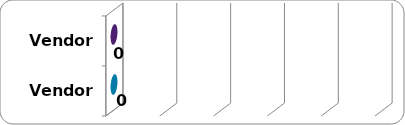
| Category | Series 0 |
|---|---|
| Vendor 1 | 0 |
| Vendor 2 | 0 |